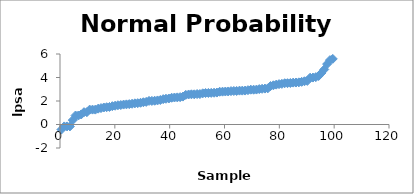
| Category | Series 0 |
|---|---|
| 0.5154639175257731 | -0.431 |
| 1.5463917525773194 | -0.163 |
| 2.5773195876288657 | -0.163 |
| 3.608247422680412 | -0.163 |
| 4.639175257731958 | 0.372 |
| 5.6701030927835046 | 0.765 |
| 6.701030927835051 | 0.765 |
| 7.731958762886597 | 0.854 |
| 8.762886597938143 | 1.047 |
| 9.79381443298969 | 1.047 |
| 10.824742268041236 | 1.267 |
| 11.855670103092782 | 1.267 |
| 12.886597938144329 | 1.267 |
| 13.917525773195875 | 1.348 |
| 14.948453608247421 | 1.399 |
| 15.979381443298967 | 1.447 |
| 17.010309278350512 | 1.47 |
| 18.04123711340206 | 1.493 |
| 19.072164948453604 | 1.558 |
| 20.103092783505154 | 1.599 |
| 21.134020618556697 | 1.639 |
| 22.164948453608247 | 1.658 |
| 23.19587628865979 | 1.696 |
| 24.22680412371134 | 1.714 |
| 25.257731958762882 | 1.732 |
| 26.288659793814432 | 1.766 |
| 27.319587628865975 | 1.8 |
| 28.350515463917525 | 1.816 |
| 29.381443298969067 | 1.848 |
| 30.412371134020617 | 1.895 |
| 31.44329896907216 | 1.924 |
| 32.47422680412371 | 2.008 |
| 33.50515463917525 | 2.008 |
| 34.536082474226795 | 2.022 |
| 35.567010309278345 | 2.048 |
| 36.597938144329895 | 2.086 |
| 37.62886597938144 | 2.158 |
| 38.65979381443298 | 2.192 |
| 39.69072164948453 | 2.214 |
| 40.72164948453608 | 2.277 |
| 41.75257731958762 | 2.298 |
| 42.783505154639165 | 2.308 |
| 43.814432989690715 | 2.327 |
| 44.845360824742265 | 2.375 |
| 45.87628865979381 | 2.522 |
| 46.90721649484535 | 2.553 |
| 47.9381443298969 | 2.569 |
| 48.96907216494845 | 2.569 |
| 49.99999999999999 | 2.592 |
| 51.030927835051536 | 2.592 |
| 52.061855670103085 | 2.657 |
| 53.092783505154635 | 2.678 |
| 54.12371134020618 | 2.684 |
| 55.15463917525772 | 2.691 |
| 56.18556701030927 | 2.705 |
| 57.21649484536082 | 2.718 |
| 58.24742268041236 | 2.788 |
| 59.278350515463906 | 2.794 |
| 60.309278350515456 | 2.806 |
| 61.340206185567006 | 2.812 |
| 62.37113402061855 | 2.842 |
| 63.40206185567009 | 2.854 |
| 64.43298969072164 | 2.854 |
| 65.4639175257732 | 2.882 |
| 66.49484536082474 | 2.882 |
| 67.52577319587628 | 2.888 |
| 68.55670103092783 | 2.92 |
| 69.58762886597938 | 2.963 |
| 70.61855670103093 | 2.963 |
| 71.64948453608247 | 2.973 |
| 72.68041237113403 | 3.013 |
| 73.71134020618557 | 3.037 |
| 74.74226804123711 | 3.056 |
| 75.77319587628865 | 3.075 |
| 76.8041237113402 | 3.275 |
| 77.83505154639175 | 3.338 |
| 78.8659793814433 | 3.393 |
| 79.89690721649484 | 3.436 |
| 80.9278350515464 | 3.458 |
| 81.95876288659794 | 3.513 |
| 82.98969072164948 | 3.516 |
| 84.02061855670102 | 3.531 |
| 85.05154639175257 | 3.565 |
| 86.08247422680412 | 3.571 |
| 87.11340206185567 | 3.588 |
| 88.14432989690721 | 3.631 |
| 89.17525773195877 | 3.68 |
| 90.20618556701031 | 3.712 |
| 91.23711340206185 | 3.984 |
| 92.2680412371134 | 3.994 |
| 93.29896907216494 | 4.03 |
| 94.3298969072165 | 4.13 |
| 95.36082474226804 | 4.385 |
| 96.39175257731958 | 4.684 |
| 97.42268041237114 | 5.143 |
| 98.45360824742268 | 5.478 |
| 99.48453608247422 | 5.583 |